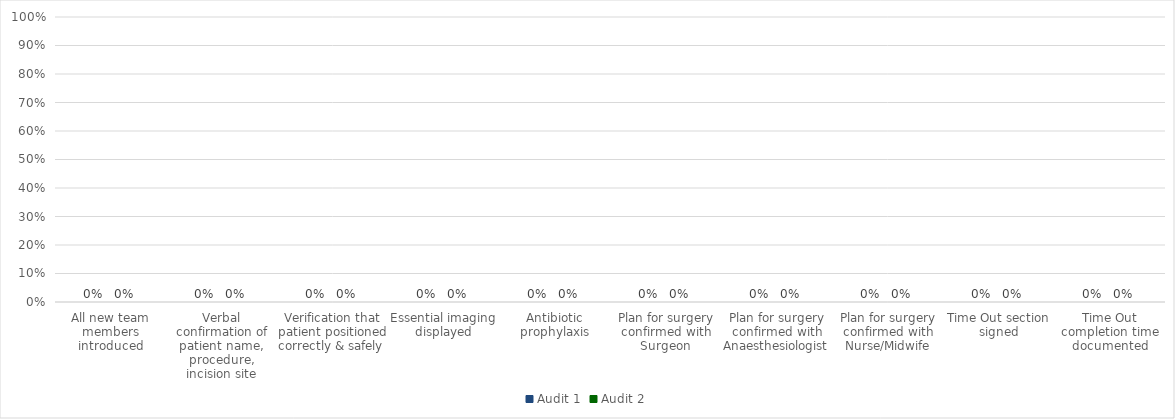
| Category | Audit 1 | Audit 2 |
|---|---|---|
| All new team members introduced | 0 | 0 |
| Verbal confirmation of patient name, procedure, incision site | 0 | 0 |
| Verification that patient positioned correctly & safely  | 0 | 0 |
| Essential imaging displayed | 0 | 0 |
| Antibiotic prophylaxis | 0 | 0 |
| Plan for surgery confirmed with Surgeon | 0 | 0 |
| Plan for surgery confirmed with Anaesthesiologist | 0 | 0 |
| Plan for surgery confirmed with Nurse/Midwife | 0 | 0 |
| Time Out section signed | 0 | 0 |
| Time Out completion time documented | 0 | 0 |